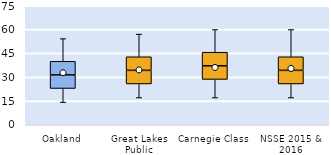
| Category | 25th | 50th | 75th |
|---|---|---|---|
| Oakland | 22.857 | 8.571 | 8.571 |
| Great Lakes Public | 25.714 | 8.571 | 8.571 |
| Carnegie Class | 28.571 | 8.571 | 8.571 |
| NSSE 2015 & 2016 | 25.714 | 8.571 | 8.571 |